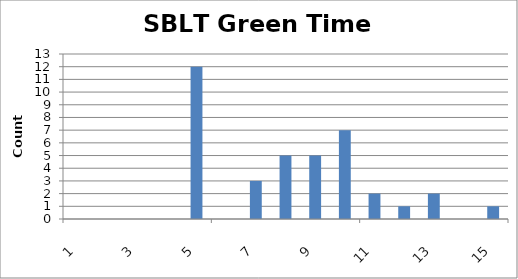
| Category | Series 0 |
|---|---|
| 0 | 0 |
| 1 | 0 |
| 2 | 0 |
| 3 | 0 |
| 4 | 12 |
| 5 | 0 |
| 6 | 3 |
| 7 | 5 |
| 8 | 5 |
| 9 | 7 |
| 10 | 2 |
| 11 | 1 |
| 12 | 2 |
| 13 | 0 |
| 14 | 1 |